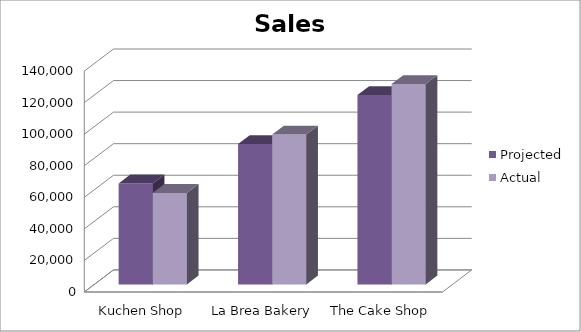
| Category | Projected | Actual |
|---|---|---|
| Kuchen Shop | 64000 | 58000 |
| La Brea Bakery | 89000 | 95000 |
| The Cake Shop | 120000 | 127000 |